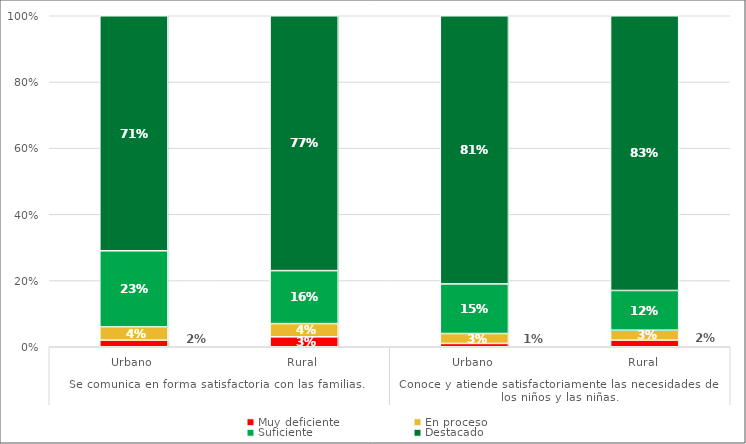
| Category | Muy deficiente | En proceso | Suficiente | Destacado |
|---|---|---|---|---|
| 0 | 0.02 | 0.04 | 0.23 | 0.71 |
| 1 | 0.03 | 0.04 | 0.16 | 0.77 |
| 2 | 0.01 | 0.03 | 0.15 | 0.81 |
| 3 | 0.02 | 0.03 | 0.12 | 0.83 |